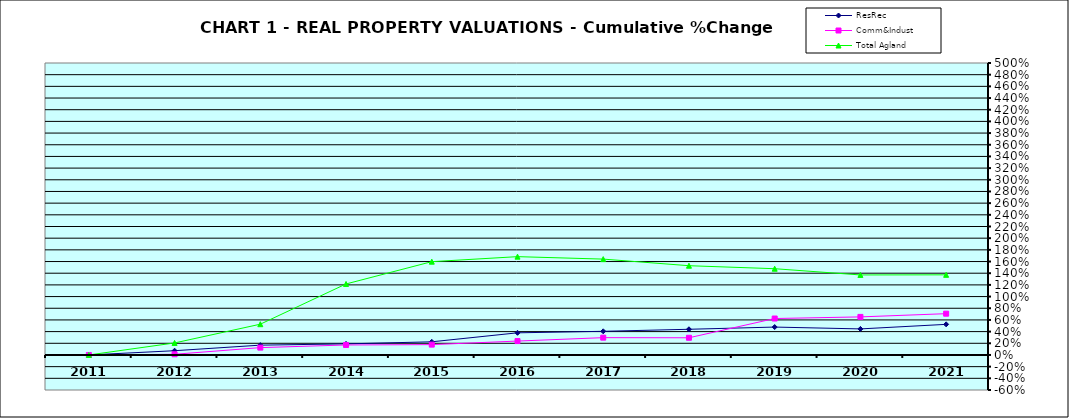
| Category | ResRec | Comm&Indust | Total Agland |
|---|---|---|---|
| 2011.0 | 0 | 0 | 0 |
| 2012.0 | 0.073 | 0.012 | 0.206 |
| 2013.0 | 0.168 | 0.126 | 0.527 |
| 2014.0 | 0.19 | 0.171 | 1.216 |
| 2015.0 | 0.225 | 0.177 | 1.598 |
| 2016.0 | 0.379 | 0.238 | 1.684 |
| 2017.0 | 0.405 | 0.296 | 1.642 |
| 2018.0 | 0.44 | 0.294 | 1.529 |
| 2019.0 | 0.478 | 0.624 | 1.477 |
| 2020.0 | 0.446 | 0.652 | 1.37 |
| 2021.0 | 0.524 | 0.707 | 1.372 |